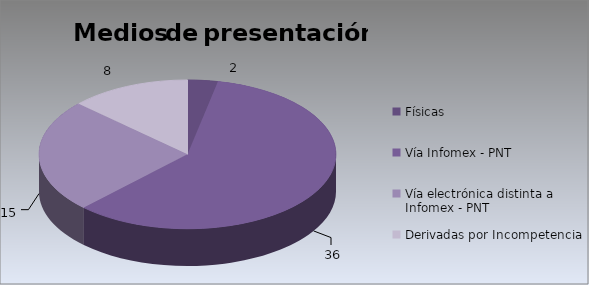
| Category | Series 0 |
|---|---|
| Físicas | 2 |
| Vía Infomex - PNT | 36 |
| Vía electrónica distinta a Infomex - PNT | 15 |
| Derivadas por Incompetencia | 8 |